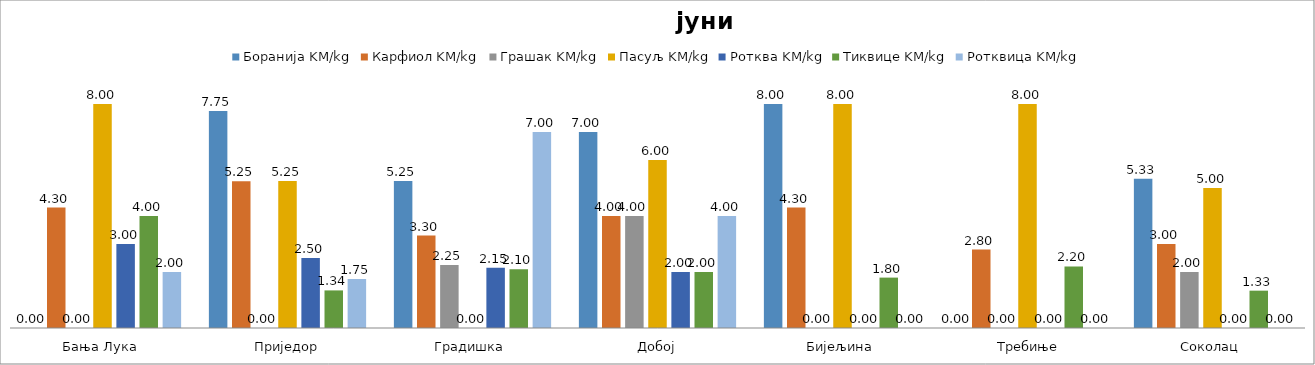
| Category | Боранија | Карфиол | Грашак | Пасуљ | Ротква | Тиквице | Ротквица |
|---|---|---|---|---|---|---|---|
| Бања Лука | 0 | 4.3 | 0 | 8 | 3 | 4 | 2 |
| Приједор | 7.75 | 5.245 | 0 | 5.25 | 2.5 | 1.342 | 1.75 |
| Градишка | 5.25 | 3.3 | 2.25 | 0 | 2.15 | 2.1 | 7 |
| Добој | 7 | 4 | 4 | 6 | 2 | 2 | 4 |
| Бијељина | 8 | 4.3 | 0 | 8 | 0 | 1.8 | 0 |
|  Требиње | 0 | 2.8 | 0 | 8 | 0 | 2.2 | 0 |
| Соколац | 5.333 | 3 | 2 | 5 | 0 | 1.333 | 0 |